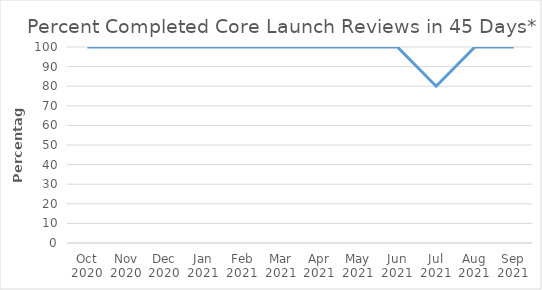
| Category | Percentage |
|---|---|
| Oct 2020 | 100 |
| Nov 2020 | 100 |
| Dec 2020 | 100 |
| Jan 2021 | 100 |
| Feb 2021 | 100 |
| Mar 2021 | 100 |
| Apr 2021 | 100 |
| May 2021 | 100 |
| Jun 2021 | 100 |
| Jul 2021 | 80 |
| Aug 2021 | 100 |
| Sep 2021 | 100 |